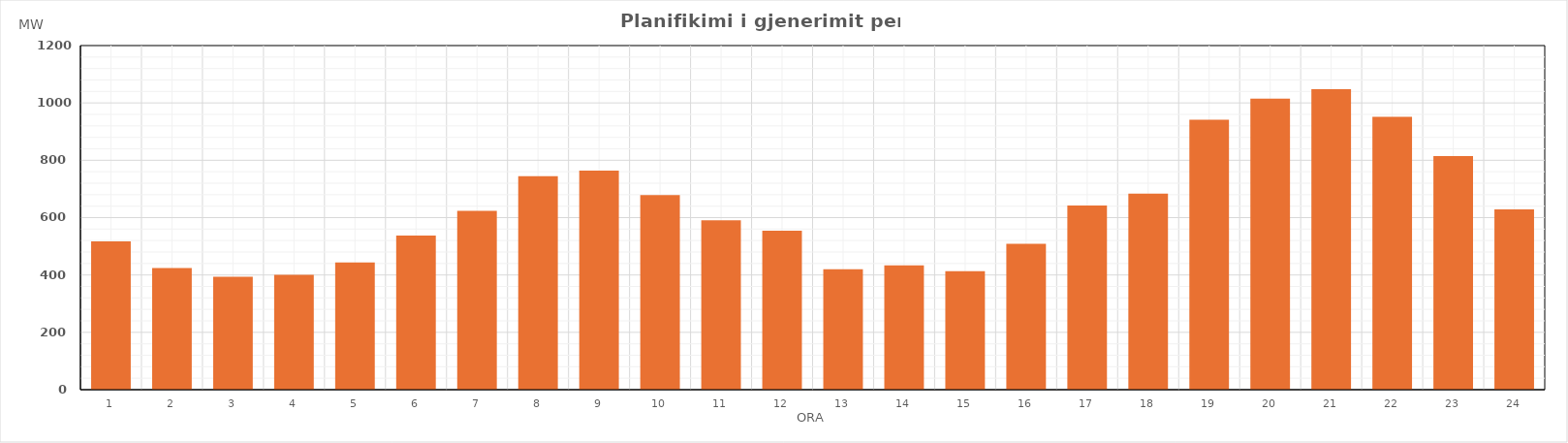
| Category | Max (MW) |
|---|---|
| 0 | 517.36 |
| 1 | 424.02 |
| 2 | 393.98 |
| 3 | 400.98 |
| 4 | 443.39 |
| 5 | 537.85 |
| 6 | 623.7 |
| 7 | 744.89 |
| 8 | 763.56 |
| 9 | 678.26 |
| 10 | 591 |
| 11 | 554.04 |
| 12 | 420.02 |
| 13 | 433.52 |
| 14 | 412.95 |
| 15 | 509.13 |
| 16 | 642.55 |
| 17 | 683.61 |
| 18 | 941.83 |
| 19 | 1015.24 |
| 20 | 1047.68 |
| 21 | 951.33 |
| 22 | 814.83 |
| 23 | 628.7 |